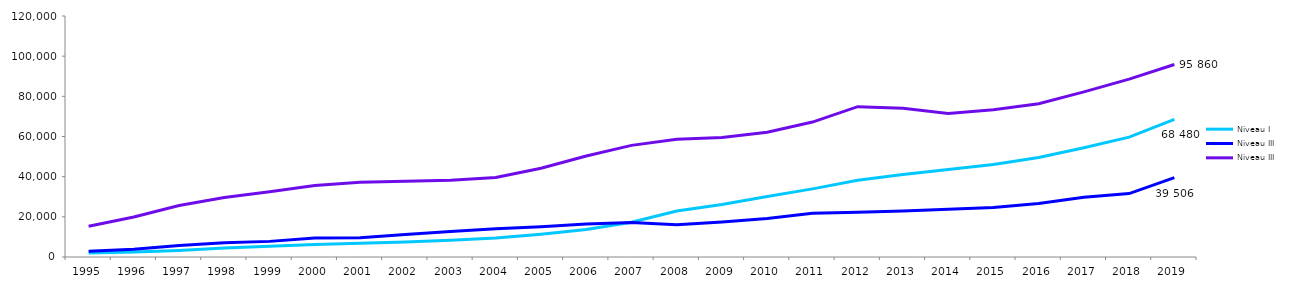
| Category | Niveau I | Niveau III |
|---|---|---|
| 1995 | 1948 | 15273 |
| 1996 | 2441 | 19952 |
| 1997 | 3250 | 25603 |
| 1998 | 4436 | 29581 |
| 1999 | 5397 | 32507 |
| 2000 | 6185 | 35553 |
| 2001 | 6852 | 37234 |
| 2002 | 7514 | 37751 |
| 2003 | 8378 | 38217 |
| 2004 | 9407 | 39560 |
| 2005 | 11341 | 44233 |
| 2006 | 13690 | 50316 |
| 2007 | 17340 | 55577 |
| 2008 | 22928 | 58572 |
| 2009 | 26156 | 59532 |
| 2010 | 30142 | 62074 |
| 2011 | 33931 | 67193 |
| 2012 | 38182 | 74868 |
| 2013 | 41027 | 74048 |
| 2014 | 43614 | 71419 |
| 2015 | 46041 | 73317 |
| 2016 | 49523 | 76326 |
| 2017 | 54364 | 82200 |
| 2018 | 59667 | 88551 |
| 2019 | 68480 | 95860 |